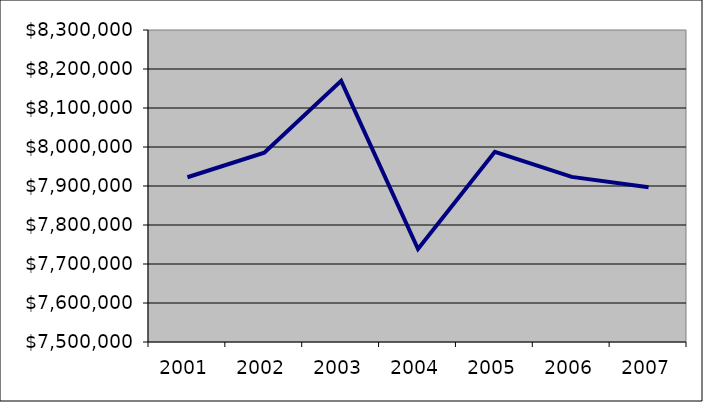
| Category | Series 0 |
|---|---|
| 2001.0 | 7922499.991 |
| 2002.0 | 7985344.534 |
| 2003.0 | 8169483.68 |
| 2004.0 | 7738355.645 |
| 2005.0 | 7987657.382 |
| 2006.0 | 7923410.852 |
| 2007.0 | 7896854.303 |